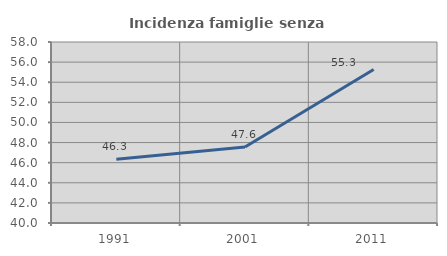
| Category | Incidenza famiglie senza nuclei |
|---|---|
| 1991.0 | 46.348 |
| 2001.0 | 47.561 |
| 2011.0 | 55.272 |